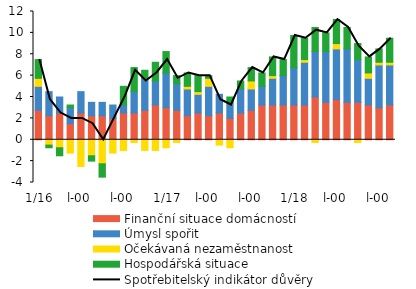
| Category | Finanční situace domácností | Úmysl spořit | Očekávaná nezaměstnanost | Hospodářská situace |
|---|---|---|---|---|
|  1/16 | 2.75 | 2.25 | 0.75 | 1.75 |
| 2 | 2.25 | 2.25 | -0.5 | -0.25 |
| 3 | 2.5 | 1.5 | -0.75 | -0.75 |
| 4 | 1.5 | 1.5 | -1.25 | 0.25 |
| 5 | 2.5 | 2 | -2.5 | 0 |
| 6 | 2.25 | 1.25 | -1.5 | -0.5 |
| 7 | 2.25 | 1.25 | -2.25 | -1.25 |
| 8 | 2 | 1.25 | -1.25 | 0 |
| 9 | 2.5 | 0.75 | -1 | 1.75 |
| 10 | 2.5 | 2 | -0.25 | 2.25 |
| 11 | 2.75 | 3 | -1 | 0.75 |
| 12 | 3.25 | 2.25 | -1 | 1.75 |
|  1/17 | 3 | 3.25 | -0.75 | 2 |
| 2 | 2.75 | 2.5 | -0.25 | 0.75 |
| 3 | 2.25 | 2.5 | 0.25 | 1.25 |
| 4 | 2.5 | 1.75 | 0.25 | 1.5 |
| 5 | 2.25 | 2.75 | 0.75 | 0.25 |
| 6 | 2.5 | 1.75 | -0.5 | 0 |
| 7 | 2 | 1.5 | -0.75 | 0.5 |
| 8 | 2.5 | 2.25 | 0 | 0.75 |
| 9 | 2.75 | 2 | 0.75 | 1.25 |
| 10 | 3.25 | 1.75 | 0 | 1.25 |
| 11 | 3.25 | 2.5 | 0.25 | 1.75 |
| 12 | 3.25 | 2.75 | 0 | 1.5 |
|  1/18 | 3.25 | 3.5 | 0 | 3 |
| 2 | 3.25 | 4 | 0.25 | 2 |
| 3 | 4 | 4.25 | -0.25 | 2.25 |
| 4 | 3.5 | 4.75 | 0 | 1.75 |
| 5 | 3.75 | 4.75 | 0.5 | 2.25 |
| 6 | 3.5 | 5 | 0 | 2 |
| 7 | 3.5 | 4 | -0.25 | 1.5 |
| 8 | 3.25 | 2.5 | 0.5 | 1.5 |
| 9 | 3 | 4 | 0.25 | 1.25 |
| 10 | 3.25 | 3.75 | 0.25 | 2.25 |